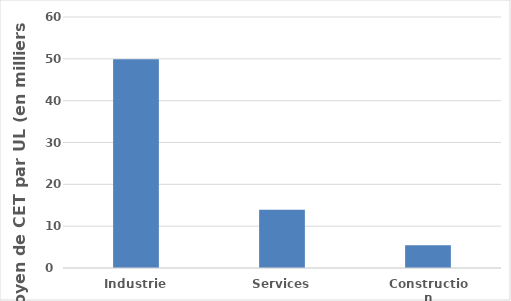
| Category | Gain moyen par UL (milliers EUR) |
|---|---|
| Industrie | 49.929 |
| Services | 13.921 |
| Construction | 5.465 |